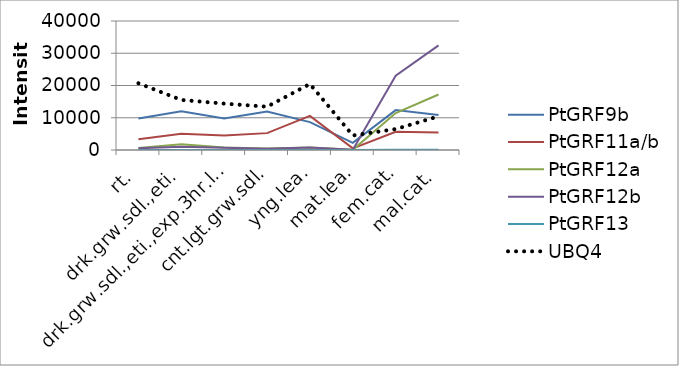
| Category | PtGRF9b | PtGRF11a/b | PtGRF12a | PtGRF12b | PtGRF13 | UBQ4 |
|---|---|---|---|---|---|---|
| rt. | 9737.43 | 3298.26 | 613.83 | 563.76 | 6.3 | 20687.1 |
| drk.grw.sdl.,eti. | 11990.3 | 5015.5 | 1817.35 | 998.15 | 1.4 | 15525.7 |
| drk.grw.sdl.,eti.,exp.3hr.lgt. | 9799 | 4530.95 | 748.75 | 709.9 | 19.64 | 14387.65 |
| cnt.lgt.grw.sdl. | 11898.59 | 5232.33 | 431.03 | 389.53 | 13.16 | 13427.06 |
| yng.lea. | 8640.73 | 10572.93 | 751.16 | 745.86 | 16.16 | 20471.63 |
| mat.lea. | 2236.67 | 502.81 | 40.73 | 87.15 | 1.14 | 4512.3 |
| fem.cat. | 12371.76 | 5627.5 | 11449.66 | 23027 | 95.76 | 6494.56 |
| mal.cat. | 10826.46 | 5409.16 | 17199.33 | 32455.36 | 67.66 | 10425.36 |